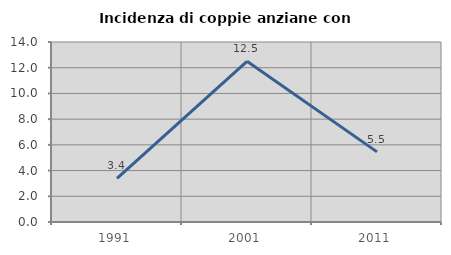
| Category | Incidenza di coppie anziane con figli |
|---|---|
| 1991.0 | 3.39 |
| 2001.0 | 12.5 |
| 2011.0 | 5.455 |